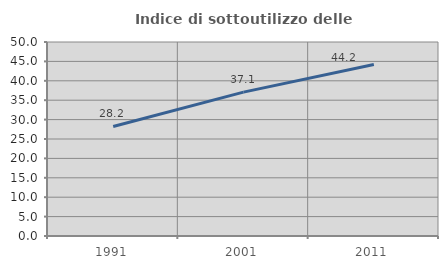
| Category | Indice di sottoutilizzo delle abitazioni  |
|---|---|
| 1991.0 | 28.225 |
| 2001.0 | 37.085 |
| 2011.0 | 44.19 |